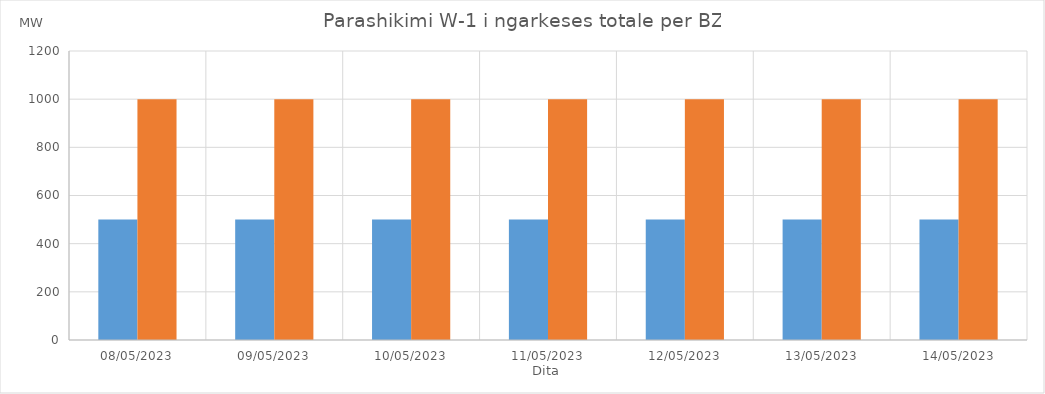
| Category | Min (MW) | Max (MW) |
|---|---|---|
| 08/05/2023 | 500 | 1000 |
| 09/05/2023 | 500 | 1000 |
| 10/05/2023 | 500 | 1000 |
| 11/05/2023 | 500 | 1000 |
| 12/05/2023 | 500 | 1000 |
| 13/05/2023 | 500 | 1000 |
| 14/05/2023 | 500 | 1000 |